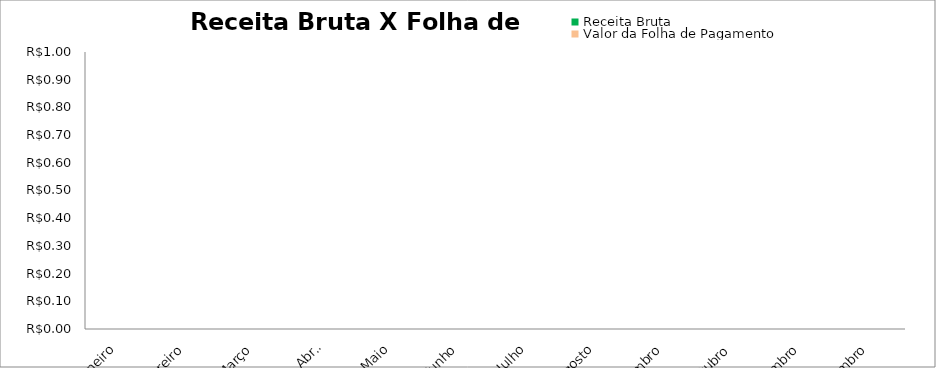
| Category | Receita Bruta | Valor da Folha de Pagamento |
|---|---|---|
| Janeiro |  | 0 |
| Fevereiro |  | 0 |
| Março |  | 0 |
| Abril |  | 0 |
| Maio |  | 0 |
| Junho |  | 0 |
| Julho |  | 0 |
| Agosto |  | 0 |
| Setembro |  | 0 |
| Outubro |  | 0 |
| Novembro |  | 0 |
| Dezembro |  | 0 |